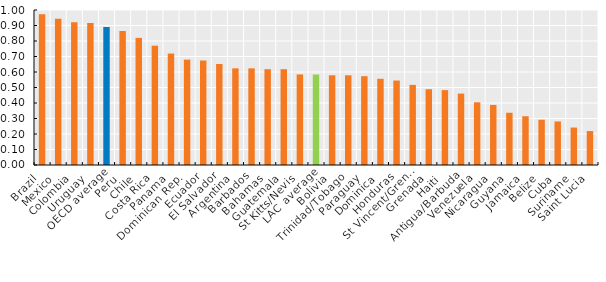
| Category | E-Participation Index |
|---|---|
| Brazil  | 0.972 |
| Mexico  | 0.944 |
| Colombia  | 0.921 |
| Uruguay  | 0.916 |
| OECD average | 0.89 |
| Peru  | 0.865 |
| Chile  | 0.82 |
| Costa Rica  | 0.77 |
| Panama  | 0.719 |
| Dominican Rep.  | 0.68 |
| Ecuador  | 0.674 |
| El Salvador  | 0.652 |
| Argentina  | 0.624 |
| Barbados  | 0.624 |
| Bahamas  | 0.618 |
| Guatemala  | 0.618 |
| St Kitts/Nevis  | 0.584 |
| LAC average | 0.584 |
| Bolivia  | 0.579 |
| Trinidad/Tobago  | 0.579 |
| Paraguay  | 0.573 |
| Dominica  | 0.556 |
| Honduras  | 0.545 |
| St Vincent/Grenad. | 0.517 |
| Grenada  | 0.489 |
| Haiti  | 0.483 |
| Antigua/Barbuda  | 0.461 |
| Venezuela  | 0.404 |
| Nicaragua  | 0.388 |
| Guyana  | 0.337 |
| Jamaica  | 0.315 |
| Belize  | 0.292 |
| Cuba  | 0.281 |
| Suriname  | 0.242 |
| Saint Lucia  | 0.219 |